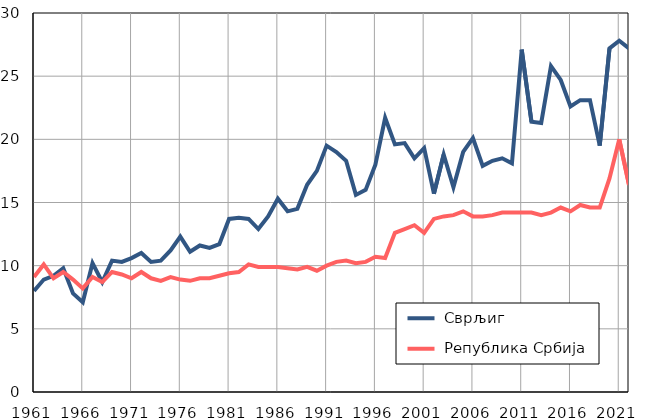
| Category |  Сврљиг |  Република Србија |
|---|---|---|
| 1961.0 | 8 | 9.1 |
| 1962.0 | 8.9 | 10.1 |
| 1963.0 | 9.2 | 9 |
| 1964.0 | 9.8 | 9.5 |
| 1965.0 | 7.8 | 8.9 |
| 1966.0 | 7.1 | 8.2 |
| 1967.0 | 10.2 | 9.1 |
| 1968.0 | 8.7 | 8.7 |
| 1969.0 | 10.4 | 9.5 |
| 1970.0 | 10.3 | 9.3 |
| 1971.0 | 10.6 | 9 |
| 1972.0 | 11 | 9.5 |
| 1973.0 | 10.3 | 9 |
| 1974.0 | 10.4 | 8.8 |
| 1975.0 | 11.2 | 9.1 |
| 1976.0 | 12.3 | 8.9 |
| 1977.0 | 11.1 | 8.8 |
| 1978.0 | 11.6 | 9 |
| 1979.0 | 11.4 | 9 |
| 1980.0 | 11.7 | 9.2 |
| 1981.0 | 13.7 | 9.4 |
| 1982.0 | 13.8 | 9.5 |
| 1983.0 | 13.7 | 10.1 |
| 1984.0 | 12.9 | 9.9 |
| 1985.0 | 13.9 | 9.9 |
| 1986.0 | 15.3 | 9.9 |
| 1987.0 | 14.3 | 9.8 |
| 1988.0 | 14.5 | 9.7 |
| 1989.0 | 16.4 | 9.9 |
| 1990.0 | 17.5 | 9.6 |
| 1991.0 | 19.5 | 10 |
| 1992.0 | 19 | 10.3 |
| 1993.0 | 18.3 | 10.4 |
| 1994.0 | 15.6 | 10.2 |
| 1995.0 | 16 | 10.3 |
| 1996.0 | 18 | 10.7 |
| 1997.0 | 21.7 | 10.6 |
| 1998.0 | 19.6 | 12.6 |
| 1999.0 | 19.7 | 12.9 |
| 2000.0 | 18.5 | 13.2 |
| 2001.0 | 19.3 | 12.6 |
| 2002.0 | 15.7 | 13.7 |
| 2003.0 | 18.8 | 13.9 |
| 2004.0 | 16.2 | 14 |
| 2005.0 | 19 | 14.3 |
| 2006.0 | 20.1 | 13.9 |
| 2007.0 | 17.9 | 13.9 |
| 2008.0 | 18.3 | 14 |
| 2009.0 | 18.5 | 14.2 |
| 2010.0 | 18.1 | 14.2 |
| 2011.0 | 27.1 | 14.2 |
| 2012.0 | 21.4 | 14.2 |
| 2013.0 | 21.3 | 14 |
| 2014.0 | 25.8 | 14.2 |
| 2015.0 | 24.7 | 14.6 |
| 2016.0 | 22.6 | 14.3 |
| 2017.0 | 23.1 | 14.8 |
| 2018.0 | 23.1 | 14.6 |
| 2019.0 | 19.5 | 14.6 |
| 2020.0 | 27.2 | 16.9 |
| 2021.0 | 27.8 | 20 |
| 2022.0 | 27.2 | 16.4 |